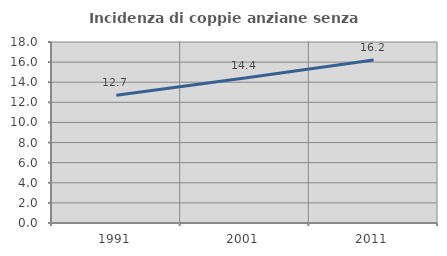
| Category | Incidenza di coppie anziane senza figli  |
|---|---|
| 1991.0 | 12.712 |
| 2001.0 | 14.414 |
| 2011.0 | 16.216 |